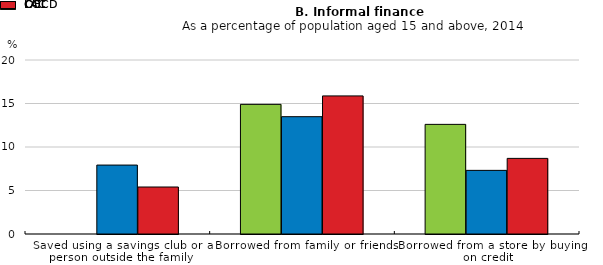
| Category | OECD | LAC | COL |
|---|---|---|---|
| Saved using a savings club or a person outside the family | 0 | 7.922 | 5.401 |
| Borrowed from family or friends | 14.902 | 13.485 | 15.872 |
| Borrowed from a store by buying on credit | 12.601 | 7.314 | 8.692 |